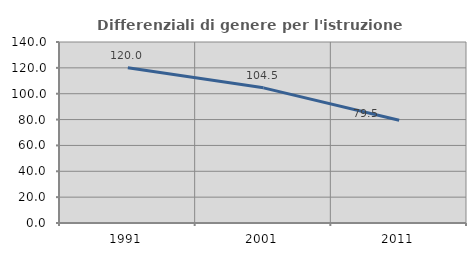
| Category | Differenziali di genere per l'istruzione superiore |
|---|---|
| 1991.0 | 120.025 |
| 2001.0 | 104.536 |
| 2011.0 | 79.497 |